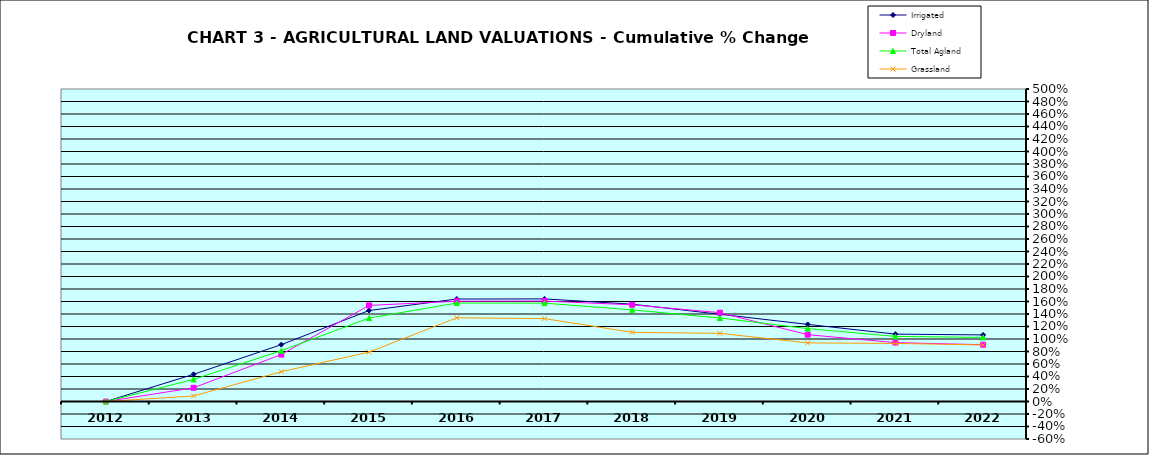
| Category | Irrigated | Dryland | Total Agland | Grassland |
|---|---|---|---|---|
| 2012.0 | 0 | 0 | 0 | 0 |
| 2013.0 | 0.435 | 0.219 | 0.354 | 0.089 |
| 2014.0 | 0.91 | 0.751 | 0.812 | 0.477 |
| 2015.0 | 1.455 | 1.537 | 1.335 | 0.79 |
| 2016.0 | 1.64 | 1.604 | 1.575 | 1.339 |
| 2017.0 | 1.642 | 1.607 | 1.574 | 1.326 |
| 2018.0 | 1.557 | 1.547 | 1.467 | 1.106 |
| 2019.0 | 1.396 | 1.421 | 1.336 | 1.09 |
| 2020.0 | 1.234 | 1.069 | 1.167 | 0.938 |
| 2021.0 | 1.078 | 0.942 | 1.042 | 0.929 |
| 2022.0 | 1.065 | 0.909 | 1.026 | 0.905 |